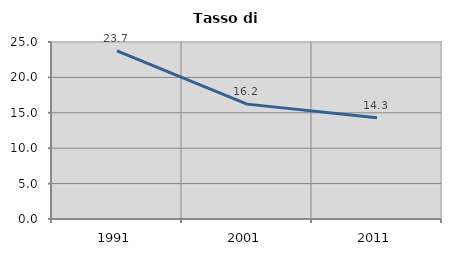
| Category | Tasso di disoccupazione   |
|---|---|
| 1991.0 | 23.733 |
| 2001.0 | 16.226 |
| 2011.0 | 14.314 |